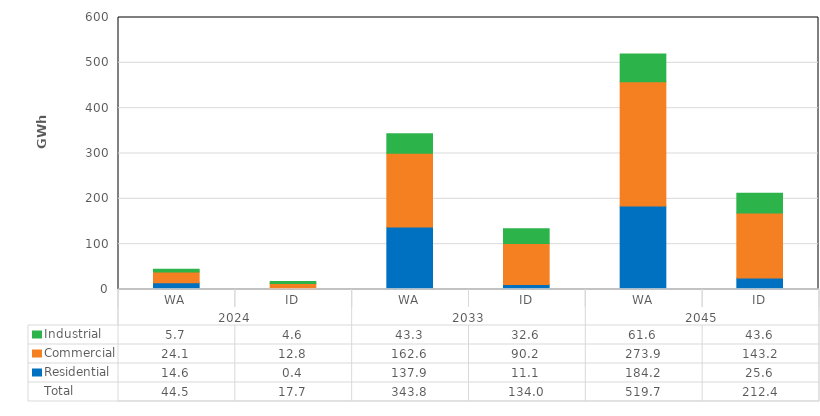
| Category | Residential | Commercial | Industrial |
|---|---|---|---|
| 0 | 14.633 | 24.119 | 5.735 |
| 1 | 0.417 | 12.766 | 4.557 |
| 2 | 137.875 | 162.559 | 43.32 |
| 3 | 11.127 | 90.205 | 32.648 |
| 4 | 184.218 | 273.85 | 61.645 |
| 5 | 25.634 | 143.157 | 43.597 |